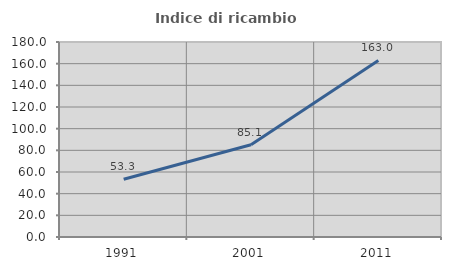
| Category | Indice di ricambio occupazionale  |
|---|---|
| 1991.0 | 53.309 |
| 2001.0 | 85.096 |
| 2011.0 | 162.987 |